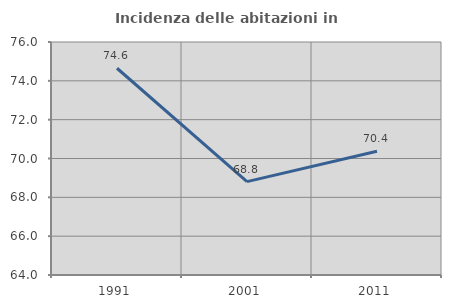
| Category | Incidenza delle abitazioni in proprietà  |
|---|---|
| 1991.0 | 74.648 |
| 2001.0 | 68.807 |
| 2011.0 | 70.37 |